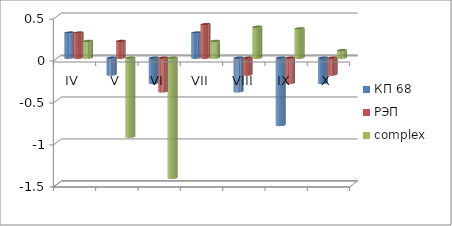
| Category | КП 68 | РЭП  | complex |
|---|---|---|---|
| IV | 0.3 | 0.3 | 0.2 |
| V | -0.2 | 0.2 | -0.94 |
| VI | -0.3 | -0.4 | -1.43 |
| VII | 0.3 | 0.4 | 0.2 |
| VIII | -0.4 | -0.2 | 0.37 |
| IX | -0.8 | -0.3 | 0.35 |
| X | -0.3 | -0.2 | 0.09 |